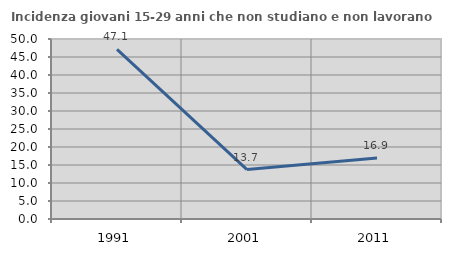
| Category | Incidenza giovani 15-29 anni che non studiano e non lavorano  |
|---|---|
| 1991.0 | 47.126 |
| 2001.0 | 13.74 |
| 2011.0 | 16.931 |